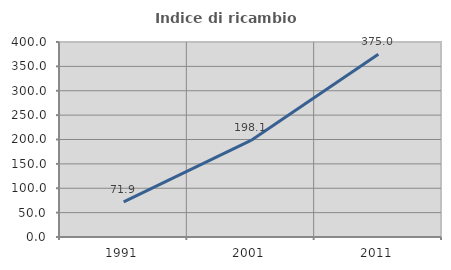
| Category | Indice di ricambio occupazionale  |
|---|---|
| 1991.0 | 71.91 |
| 2001.0 | 198.077 |
| 2011.0 | 375 |